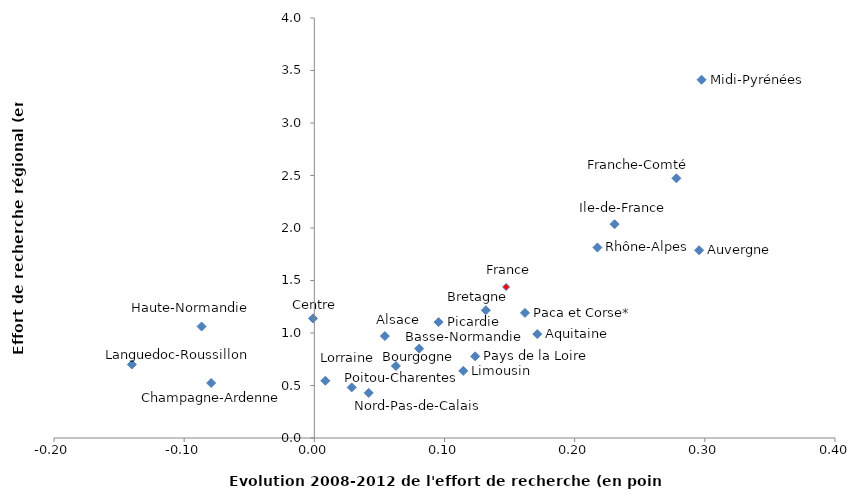
| Category | Series 0 |
|---|---|
| 0.23065057587233276 | 2.036 |
| 0.2175128721320141 | 1.814 |
| 0.2974812508853328 | 3.412 |
| 0.16181439702641387 | 1.191 |
| 0.1317333192515183 | 1.217 |
| 0.17127386746340847 | 0.99 |
| 0.12355256023413014 | 0.778 |
| -0.0010395839725396705 | 1.139 |
| 0.2781590089319403 | 2.473 |
| 0.29560130043846217 | 1.788 |
| -0.08664154548969627 | 1.062 |
| 0.054183359929138586 | 0.971 |
| 0.09544491999927529 | 1.104 |
| -0.14018696879715054 | 0.7 |
| 0.041816470172099246 | 0.429 |
| 0.08057548393882452 | 0.852 |
| 0.008501218454119459 | 0.546 |
| 0.06268577846973433 | 0.685 |
| 0.02870481038315057 | 0.482 |
| -0.07926737650177174 | 0.524 |
| 0.11446412971730206 | 0.639 |
| 0.147316671250131 | 1.438 |